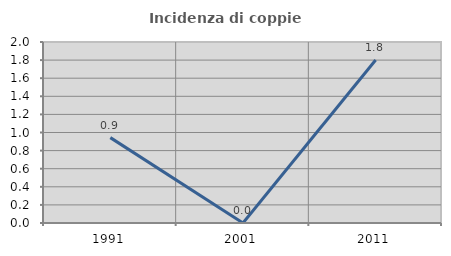
| Category | Incidenza di coppie miste |
|---|---|
| 1991.0 | 0.943 |
| 2001.0 | 0 |
| 2011.0 | 1.802 |